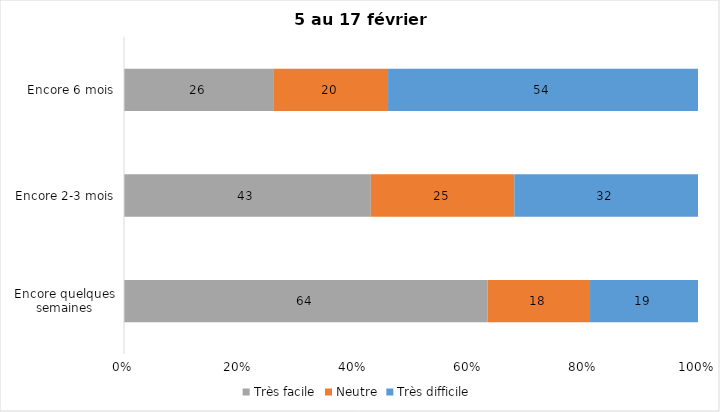
| Category | Très facile | Neutre | Très difficile |
|---|---|---|---|
| Encore quelques semaines | 64 | 18 | 19 |
| Encore 2-3 mois | 43 | 25 | 32 |
| Encore 6 mois | 26 | 20 | 54 |